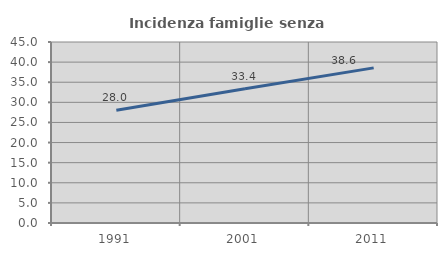
| Category | Incidenza famiglie senza nuclei |
|---|---|
| 1991.0 | 28.017 |
| 2001.0 | 33.378 |
| 2011.0 | 38.563 |